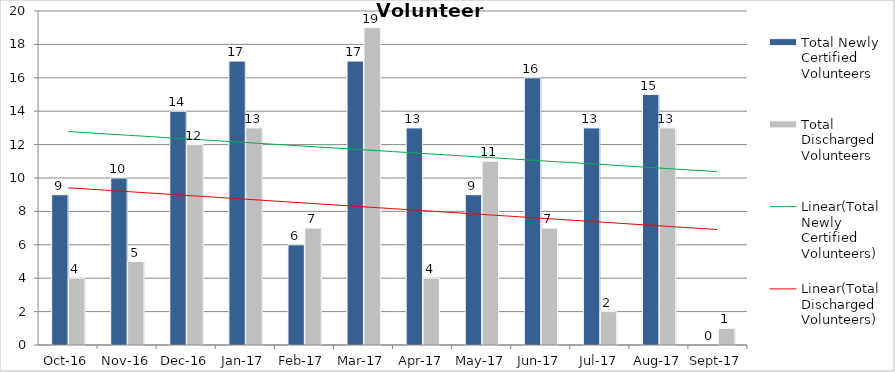
| Category | Total Newly Certified Volunteers | Total Discharged Volunteers |
|---|---|---|
| 2016-10-01 | 9 | 4 |
| 2016-11-01 | 10 | 5 |
| 2016-12-01 | 14 | 12 |
| 2017-01-01 | 17 | 13 |
| 2017-02-01 | 6 | 7 |
| 2017-03-01 | 17 | 19 |
| 2017-04-01 | 13 | 4 |
| 2017-05-01 | 9 | 11 |
| 2017-06-01 | 16 | 7 |
| 2017-07-01 | 13 | 2 |
| 2017-08-01 | 15 | 13 |
| 2017-09-01 | 0 | 1 |